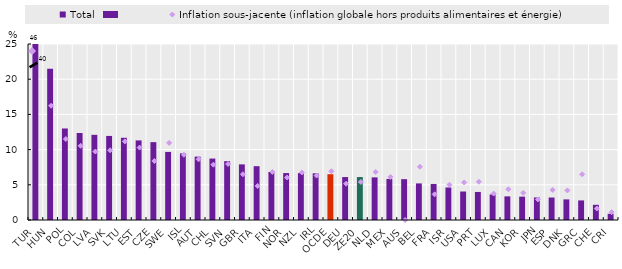
| Category | Total |
|---|---|
| TUR | 39.585 |
| HUN | 21.5 |
| POL | 13 |
| COL | 12.36 |
| LVA | 12.098 |
| SVK | 11.941 |
| LTU | 11.681 |
| EST | 11.306 |
| CZE | 11.061 |
| SWE | 9.669 |
| ISL | 9.467 |
| AUT | 9 |
| CHL | 8.727 |
| SVN | 8.356 |
| GBR | 7.9 |
| ITA | 7.644 |
| FIN | 6.82 |
| NOR | 6.667 |
| NZL | 6.655 |
| IRL | 6.631 |
| OCDE | 6.506 |
| DEU | 6.102 |
| ZE20 | 6.1 |
| NLD | 6.056 |
| MEX | 5.835 |
| AUS | 5.8 |
| BEL | 5.198 |
| FRA | 5.12 |
| ISR | 4.618 |
| USA | 4.048 |
| PRT | 3.985 |
| LUX | 3.625 |
| CAN | 3.357 |
| KOR | 3.319 |
| JPN | 3.2 |
| ESP | 3.193 |
| DNK | 2.928 |
| GRC | 2.782 |
| CHE | 2.159 |
| CRI | 0.879 |